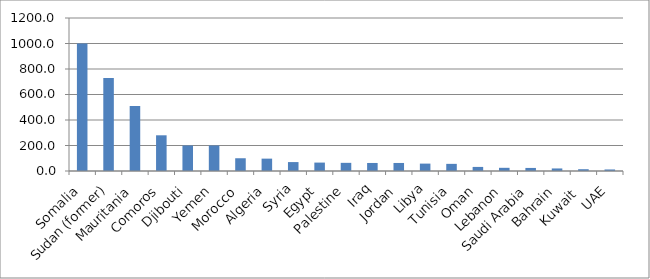
| Category | Series 0 |
|---|---|
| Somalia | 1000 |
| Sudan (former) | 730 |
| Mauritania | 510 |
| Comoros | 280 |
| Djibouti | 200 |
| Yemen | 200 |
| Morocco | 100 |
| Algeria | 97 |
| Syria | 70 |
| Egypt | 66 |
| Palestine | 64 |
| Iraq | 63 |
| Jordan | 63 |
| Libya | 58 |
| Tunisia | 56 |
| Oman | 32 |
| Lebanon | 25 |
| Saudi Arabia | 24 |
| Bahrain | 20 |
| Kuwait  | 14 |
| UAE | 12 |